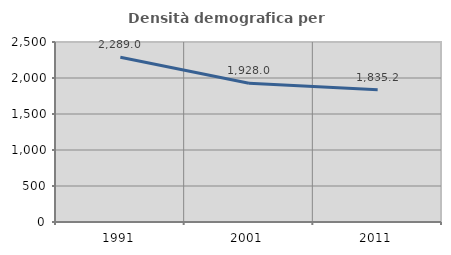
| Category | Densità demografica |
|---|---|
| 1991.0 | 2288.992 |
| 2001.0 | 1928.042 |
| 2011.0 | 1835.23 |